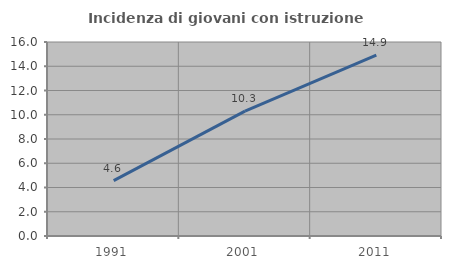
| Category | Incidenza di giovani con istruzione universitaria |
|---|---|
| 1991.0 | 4.561 |
| 2001.0 | 10.294 |
| 2011.0 | 14.925 |